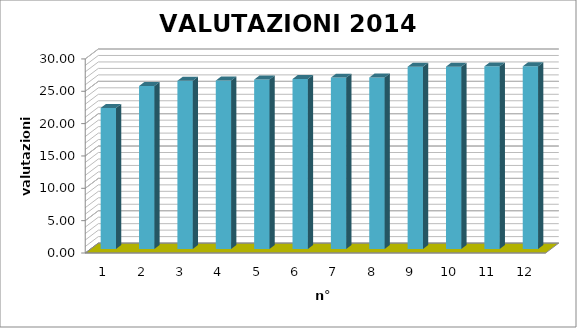
| Category | Series 0 |
|---|---|
| 0 | 21.8 |
| 1 | 25.19 |
| 2 | 26 |
| 3 | 26.04 |
| 4 | 26.19 |
| 5 | 26.28 |
| 6 | 26.49 |
| 7 | 26.5 |
| 8 | 28.18 |
| 9 | 28.19 |
| 10 | 28.23 |
| 11 | 28.24 |